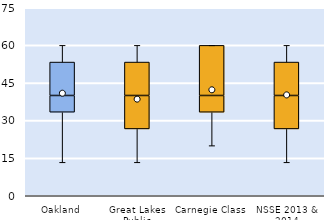
| Category | 25th | 50th | 75th |
|---|---|---|---|
| Oakland | 33.333 | 6.667 | 13.333 |
| Great Lakes Public | 26.667 | 13.333 | 13.333 |
| Carnegie Class | 33.333 | 6.667 | 20 |
| NSSE 2013 & 2014 | 26.667 | 13.333 | 13.333 |